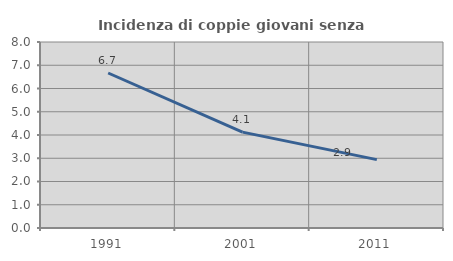
| Category | Incidenza di coppie giovani senza figli |
|---|---|
| 1991.0 | 6.667 |
| 2001.0 | 4.124 |
| 2011.0 | 2.941 |